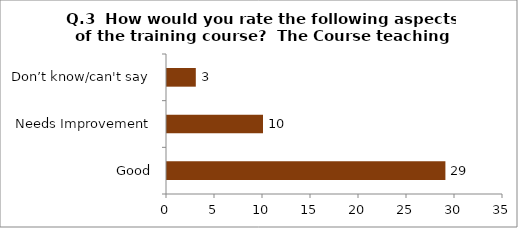
| Category | Q.3  How would you rate the following aspects of the training course?  |
|---|---|
| Good | 29 |
| Needs Improvement | 10 |
| Don’t know/can't say | 3 |